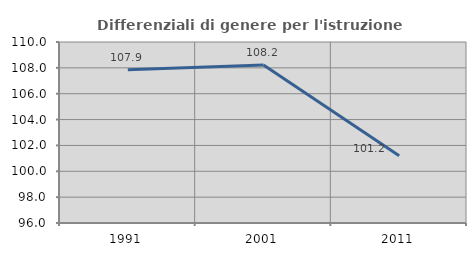
| Category | Differenziali di genere per l'istruzione superiore |
|---|---|
| 1991.0 | 107.85 |
| 2001.0 | 108.223 |
| 2011.0 | 101.199 |